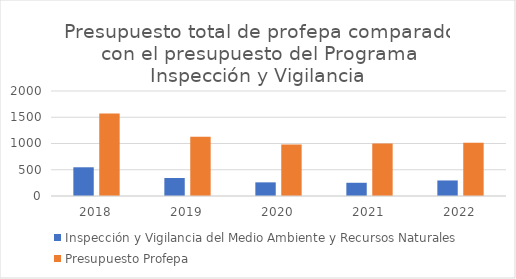
| Category | Inspección y Vigilancia del Medio Ambiente y Recursos Naturales | Presupuesto Profepa |
|---|---|---|
| 2018.0 | 547 | 1573 |
| 2019.0 | 343 | 1129 |
| 2020.0 | 260 | 982 |
| 2021.0 | 252 | 1002 |
| 2022.0 | 296 | 1014 |